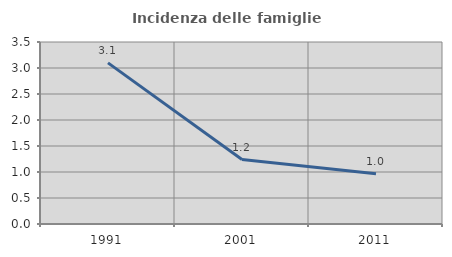
| Category | Incidenza delle famiglie numerose |
|---|---|
| 1991.0 | 3.098 |
| 2001.0 | 1.239 |
| 2011.0 | 0.965 |